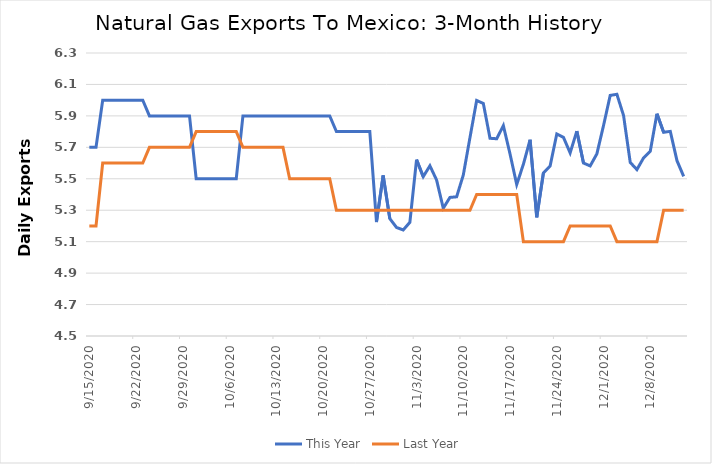
| Category | This Year | Last Year |
|---|---|---|
| 9/15/20 | 5.7 | 5.2 |
| 9/16/20 | 5.7 | 5.2 |
| 9/17/20 | 6 | 5.6 |
| 9/18/20 | 6 | 5.6 |
| 9/19/20 | 6 | 5.6 |
| 9/20/20 | 6 | 5.6 |
| 9/21/20 | 6 | 5.6 |
| 9/22/20 | 6 | 5.6 |
| 9/23/20 | 6 | 5.6 |
| 9/24/20 | 5.9 | 5.7 |
| 9/25/20 | 5.9 | 5.7 |
| 9/26/20 | 5.9 | 5.7 |
| 9/27/20 | 5.9 | 5.7 |
| 9/28/20 | 5.9 | 5.7 |
| 9/29/20 | 5.9 | 5.7 |
| 9/30/20 | 5.9 | 5.7 |
| 10/1/20 | 5.5 | 5.8 |
| 10/2/20 | 5.5 | 5.8 |
| 10/3/20 | 5.5 | 5.8 |
| 10/4/20 | 5.5 | 5.8 |
| 10/5/20 | 5.5 | 5.8 |
| 10/6/20 | 5.5 | 5.8 |
| 10/7/20 | 5.5 | 5.8 |
| 10/8/20 | 5.9 | 5.7 |
| 10/9/20 | 5.9 | 5.7 |
| 10/10/20 | 5.9 | 5.7 |
| 10/11/20 | 5.9 | 5.7 |
| 10/12/20 | 5.9 | 5.7 |
| 10/13/20 | 5.9 | 5.7 |
| 10/14/20 | 5.9 | 5.7 |
| 10/15/20 | 5.9 | 5.5 |
| 10/16/20 | 5.9 | 5.5 |
| 10/17/20 | 5.9 | 5.5 |
| 10/18/20 | 5.9 | 5.5 |
| 10/19/20 | 5.9 | 5.5 |
| 10/20/20 | 5.9 | 5.5 |
| 10/21/20 | 5.9 | 5.5 |
| 10/22/20 | 5.8 | 5.3 |
| 10/23/20 | 5.8 | 5.3 |
| 10/24/20 | 5.8 | 5.3 |
| 10/25/20 | 5.8 | 5.3 |
| 10/26/20 | 5.8 | 5.3 |
| 10/27/20 | 5.8 | 5.3 |
| 10/28/20 | 5.225 | 5.3 |
| 10/29/20 | 5.521 | 5.3 |
| 10/30/20 | 5.246 | 5.3 |
| 10/31/20 | 5.19 | 5.3 |
| 11/1/20 | 5.174 | 5.3 |
| 11/2/20 | 5.223 | 5.3 |
| 11/3/20 | 5.622 | 5.3 |
| 11/4/20 | 5.513 | 5.3 |
| 11/5/20 | 5.583 | 5.3 |
| 11/6/20 | 5.492 | 5.3 |
| 11/7/20 | 5.313 | 5.3 |
| 11/8/20 | 5.381 | 5.3 |
| 11/9/20 | 5.385 | 5.3 |
| 11/10/20 | 5.524 | 5.3 |
| 11/11/20 | 5.762 | 5.3 |
| 11/12/20 | 5.998 | 5.4 |
| 11/13/20 | 5.979 | 5.4 |
| 11/14/20 | 5.758 | 5.4 |
| 11/15/20 | 5.755 | 5.4 |
| 11/16/20 | 5.838 | 5.4 |
| 11/17/20 | 5.658 | 5.4 |
| 11/18/20 | 5.463 | 5.4 |
| 11/19/20 | 5.592 | 5.1 |
| 11/20/20 | 5.748 | 5.1 |
| 11/21/20 | 5.255 | 5.1 |
| 11/22/20 | 5.538 | 5.1 |
| 11/23/20 | 5.582 | 5.1 |
| 11/24/20 | 5.785 | 5.1 |
| 11/25/20 | 5.763 | 5.1 |
| 11/26/20 | 5.665 | 5.2 |
| 11/27/20 | 5.803 | 5.2 |
| 11/28/20 | 5.6 | 5.2 |
| 11/29/20 | 5.582 | 5.2 |
| 11/30/20 | 5.658 | 5.2 |
| 12/1/20 | 5.839 | 5.2 |
| 12/2/20 | 6.03 | 5.2 |
| 12/3/20 | 6.037 | 5.1 |
| 12/4/20 | 5.902 | 5.1 |
| 12/5/20 | 5.604 | 5.1 |
| 12/6/20 | 5.558 | 5.1 |
| 12/7/20 | 5.633 | 5.1 |
| 12/8/20 | 5.675 | 5.1 |
| 12/9/20 | 5.914 | 5.1 |
| 12/10/20 | 5.796 | 5.3 |
| 12/11/20 | 5.802 | 5.3 |
| 12/12/20 | 5.615 | 5.3 |
| 12/13/20 | 5.516 | 5.3 |